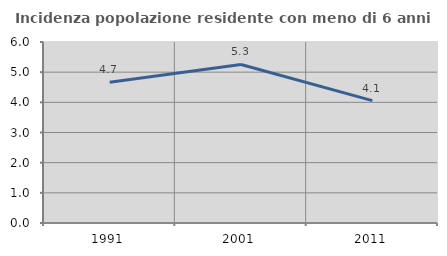
| Category | Incidenza popolazione residente con meno di 6 anni |
|---|---|
| 1991.0 | 4.662 |
| 2001.0 | 5.256 |
| 2011.0 | 4.057 |